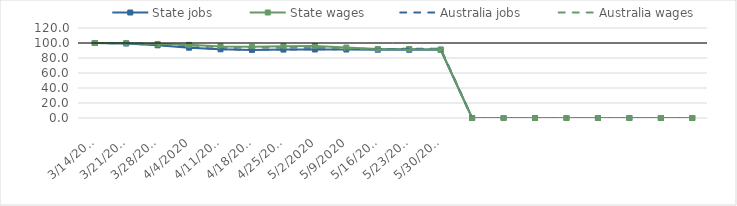
| Category | State jobs | State wages | Australia jobs | Australia wages |
|---|---|---|---|---|
| 14/03/2020 | 100 | 100 | 100 | 100 |
| 21/03/2020 | 99.34 | 99.798 | 99.552 | 99.902 |
| 28/03/2020 | 96.896 | 98.759 | 97.088 | 98.771 |
| 04/04/2020 | 93.726 | 97.517 | 94.15 | 97.007 |
| 11/04/2020 | 91.586 | 95.461 | 91.933 | 94.434 |
| 18/04/2020 | 90.752 | 94.837 | 91.108 | 94.115 |
| 25/04/2020 | 91.174 | 95.734 | 91.306 | 94.452 |
| 02/05/2020 | 91.337 | 96.128 | 91.63 | 94.778 |
| 09/05/2020 | 91.322 | 93.904 | 91.91 | 92.892 |
| 16/05/2020 | 91.045 | 91.934 | 92.165 | 91.712 |
| 23/05/2020 | 90.922 | 92.058 | 92.167 | 91.106 |
| 30/05/2020 | 90.994 | 91.309 | 92.546 | 91.708 |